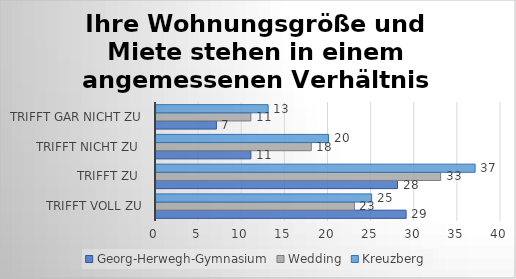
| Category | Georg-Herwegh-Gymnasium | Wedding | Kreuzberg |
|---|---|---|---|
| trifft voll zu | 29 | 23 | 25 |
| trifft zu  | 28 | 33 | 37 |
| trifft nicht zu  | 11 | 18 | 20 |
| trifft gar nicht zu | 7 | 11 | 13 |